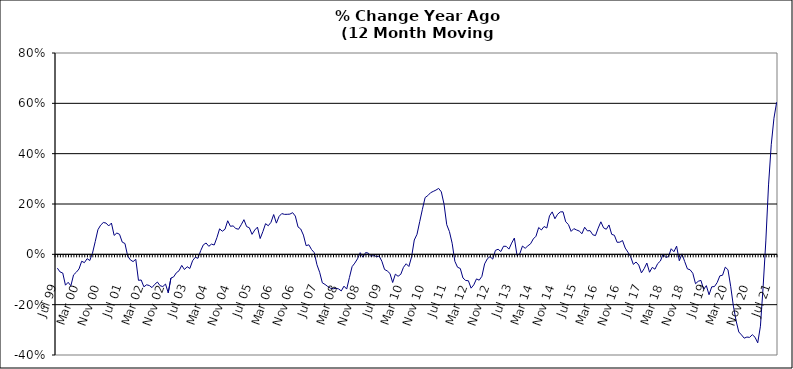
| Category | Series 0 |
|---|---|
| Jul 99 | -0.055 |
| Aug 99 | -0.07 |
| Sep 99 | -0.074 |
| Oct 99 | -0.123 |
| Nov 99 | -0.111 |
| Dec 99 | -0.125 |
| Jan 00 | -0.082 |
| Feb 00 | -0.071 |
| Mar 00 | -0.058 |
| Apr 00 | -0.027 |
| May 00 | -0.033 |
| Jun 00 | -0.017 |
| Jul 00 | -0.025 |
| Aug 00 | 0.005 |
| Sep 00 | 0.05 |
| Oct 00 | 0.098 |
| Nov 00 | 0.116 |
| Dec 00 | 0.127 |
| Jan 01 | 0.124 |
| Feb 01 | 0.113 |
| Mar 01 | 0.124 |
| Apr 01 | 0.075 |
| May 01 | 0.085 |
| Jun 01 | 0.08 |
| Jul 01 | 0.048 |
| Aug 01 | 0.043 |
| Sep 01 | -0.007 |
| Oct 01 | -0.022 |
| Nov 01 | -0.029 |
| Dec 01 | -0.02 |
| Jan 02 | -0.103 |
| Feb 02 | -0.102 |
| Mar 02 | -0.129 |
| Apr 02 | -0.121 |
| May 02 | -0.124 |
| Jun 02 | -0.132 |
| Jul 02 | -0.119 |
| Aug 02 | -0.11 |
| Sep 02 | -0.125 |
| Oct 02 | -0.128 |
| Nov 02 | -0.118 |
| Dec 02 | -0.153 |
| Jan 03 | -0.094 |
| Feb 03 | -0.09 |
| Mar 03 | -0.073 |
| Apr 03 | -0.065 |
| May 03 | -0.044 |
| Jun 03 | -0.06 |
| Jul 03 | -0.049 |
| Aug 03 | -0.056 |
| Sep 03 | -0.026 |
| Oct 03 | -0.012 |
| Nov 03 | -0.016 |
| Dec 03 | 0.014 |
| Jan 04 | 0.038 |
| Feb 04 | 0.045 |
| Mar 04 | 0.032 |
| Apr 04 | 0.041 |
| May 04 | 0.037 |
| Jun 04 | 0.066 |
| Jul 04 | 0.101 |
| Aug 04 | 0.092 |
| Sep 04 | 0.1 |
| Oct 04 | 0.133 |
| Nov 04 | 0.111 |
| Dec 04 | 0.113 |
| Jan 05 | 0.103 |
| Feb 05 | 0.1 |
| Mar 05 | 0.118 |
| Apr 05 | 0.138 |
| May 05 | 0.11 |
| Jun 05 | 0.106 |
| Jul 05 | 0.079 |
| Aug 05 | 0.097 |
| Sep 05 | 0.108 |
| Oct 05 | 0.063 |
| Nov 05 | 0.09 |
| Dec 05 | 0.122 |
| Jan 06 | 0.114 |
| Feb 06 | 0.127 |
| Mar 06 | 0.158 |
| Apr 06 | 0.124 |
| May 06 | 0.151 |
| Jun 06 | 0.162 |
| Jul 06 | 0.159 |
| Aug 06 | 0.159 |
| Sep 06 | 0.16 |
| Oct 06 | 0.166 |
| Nov 06 | 0.152 |
| Dec 06 | 0.109 |
| Jan 07 | 0.101 |
| Feb 07 | 0.076 |
| Mar 07 | 0.034 |
| Apr 07 | 0.038 |
| May 07 | 0.019 |
| Jun 07 | 0.007 |
| Jul 07 | -0.041 |
| Aug 07 | -0.071 |
| Sep 07 | -0.113 |
| Oct 07 | -0.12 |
| Nov 07 | -0.128 |
| Dec 07 | -0.135 |
| Jan 08 | -0.137 |
| Feb 08 | -0.135 |
| Mar 08 | -0.137 |
| Apr 08 | -0.145 |
| May 08 | -0.126 |
| Jun 08 | -0.138 |
| Jul 08 | -0.093 |
| Aug 08 | -0.049 |
| Sep-08 | -0.035 |
| Oct 08 | -0.018 |
| Nov 08 | 0.007 |
| Dec 08 | -0.011 |
| Jan 09 | 0.007 |
| Feb 09 | 0.005 |
| Mar 09 | -0.009 |
| Apr 09 | -0.003 |
| May 09 | -0.01 |
| Jun 09 | -0.007 |
| Jul 09 | -0.027 |
| Aug 09 | -0.06 |
| Sep 09 | -0.066 |
| Oct 09 | -0.076 |
| Nov 09 | -0.112 |
| Dec 09 | -0.079 |
| Jan 10 | -0.087 |
| Feb 10 | -0.079 |
| Mar 10 | -0.052 |
| Apr 10 | -0.037 |
| May 10 | -0.048 |
| Jun 10 | -0.01 |
| Jul 10 | 0.057 |
| Aug 10 | 0.08 |
| Sep 10 | 0.13 |
| Oct 10 | 0.179 |
| Nov 10 | 0.226 |
| Dec 10 | 0.233 |
| Jan 11 | 0.245 |
| Feb 11 | 0.25 |
| Mar 11 | 0.255 |
| Apr 11 | 0.262 |
| May 11 | 0.248 |
| Jun 11 | 0.199 |
| Jul 11 | 0.118 |
| Aug 11 | 0.09 |
| Sep 11 | 0.044 |
| Oct 11 | -0.028 |
| Nov 11 | -0.051 |
| Dec 11 | -0.056 |
| Jan 12 | -0.094 |
| Feb 12 | -0.104 |
| Mar 12 | -0.105 |
| Apr 12 | -0.134 |
| May 12 | -0.121 |
| Jun 12 | -0.098 |
| Jul 12 | -0.103 |
| Aug 12 | -0.087 |
| Sep 12 | -0.038 |
| Oct 12 | -0.018 |
| Nov 12 | -0.009 |
| Dec 12 | -0.019 |
| Jan 13 | 0.016 |
| Feb-13 | 0.02 |
| Mar-13 | 0.011 |
| Apr 13 | 0.032 |
| May 13 | 0.032 |
| Jun-13 | 0.021 |
| Jul 13 | 0.045 |
| Aug 13 | 0.065 |
| Sep 13 | -0.005 |
| Oct 13 | 0.002 |
| Nov 13 | 0.033 |
| Dec 13 | 0.024 |
| Jan 14 | 0.034 |
| Feb-14 | 0.042 |
| Mar 14 | 0.061 |
| Apr 14 | 0.072 |
| May 14 | 0.107 |
| Jun 14 | 0.097 |
| Jul-14 | 0.111 |
| Aug-14 | 0.105 |
| Sep 14 | 0.153 |
| Oct 14 | 0.169 |
| Nov 14 | 0.141 |
| Dec 14 | 0.159 |
| Jan 15 | 0.169 |
| Feb 15 | 0.169 |
| Mar 15 | 0.129 |
| Apr-15 | 0.118 |
| May 15 | 0.091 |
| Jun-15 | 0.102 |
| Jul 15 | 0.097 |
| Aug 15 | 0.092 |
| Sep 15 | 0.082 |
| Oct 15 | 0.108 |
| Nov 15 | 0.093 |
| Dec 15 | 0.094 |
| Jan 16 | 0.078 |
| Feb 16 | 0.075 |
| Mar 16 | 0.104 |
| Apr 16 | 0.129 |
| May 16 | 0.105 |
| Jun 16 | 0.1 |
| Jul 16 | 0.117 |
| Aug 16 | 0.08 |
| Sep 16 | 0.076 |
| Oct 16 | 0.048 |
| Nov 16 | 0.048 |
| Dec 16 | 0.055 |
| Jan 17 | 0.025 |
| Feb 17 | 0.009 |
| Mar 17 | -0.01 |
| Apr 17 | -0.04 |
| May 17 | -0.031 |
| Jun 17 | -0.042 |
| Jul 17 | -0.074 |
| Aug 17 | -0.057 |
| Sep 17 | -0.035 |
| Oct 17 | -0.071 |
| Nov 17 | -0.052 |
| Dec 17 | -0.059 |
| Jan 18 | -0.037 |
| Feb 18 | -0.027 |
| Mar 18 | 0 |
| Apr 18 | -0.012 |
| May 18 | -0.009 |
| Jun 18 | 0.022 |
| Jul 18 | 0.01 |
| Aug 18 | 0.033 |
| Sep 18 | -0.025 |
| Oct 18 | 0.002 |
| Nov 18 | -0.029 |
| Dec 18 | -0.058 |
| Jan 19 | -0.061 |
| Feb 19 | -0.075 |
| Mar 19 | -0.117 |
| Apr 19 | -0.107 |
| May 19 | -0.104 |
| Jun 19 | -0.139 |
| Jul 19 | -0.124 |
| Aug 19 | -0.16 |
| Sep 19 | -0.129 |
| Oct 19 | -0.128 |
| Nov 19 | -0.112 |
| Dec 19 | -0.085 |
| Jan 20 | -0.083 |
| Feb 20 | -0.051 |
| Mar 20 | -0.061 |
| Apr 20 | -0.127 |
| May 20 | -0.206 |
| Jun 20 | -0.264 |
| Jul 20 | -0.308 |
| Aug 20 | -0.32 |
| Sep 20 | -0.333 |
| Oct 20 | -0.329 |
| Nov 20 | -0.33 |
| Dec 20 | -0.319 |
| Jan 21 | -0.329 |
| Feb 21 | -0.352 |
| Mar 21 | -0.286 |
| Apr 21 | -0.129 |
| May 21 | 0.053 |
| Jun 21 | 0.276 |
| Jul 21 | 0.435 |
| Aug 21 | 0.541 |
| Sep 21 | 0.604 |